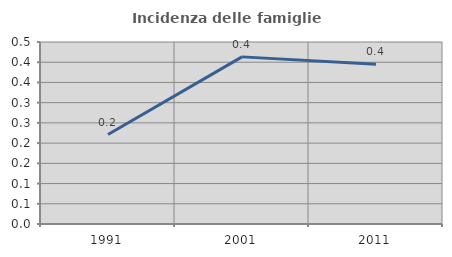
| Category | Incidenza delle famiglie numerose |
|---|---|
| 1991.0 | 0.221 |
| 2001.0 | 0.413 |
| 2011.0 | 0.395 |